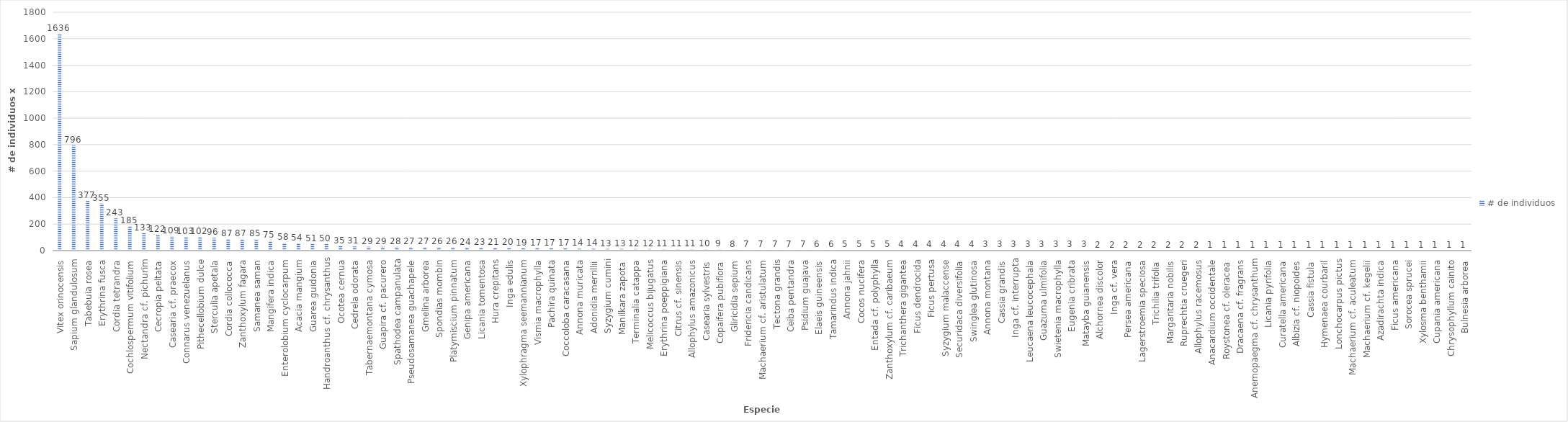
| Category | # de individuos |
|---|---|
| Vitex orinocensis | 1636 |
| Sapium glandulosum | 796 |
| Tabebuia rosea | 377 |
| Erythrina fusca | 355 |
| Cordia tetrandra | 243 |
| Cochlospermum vitifolium | 185 |
| Nectandra cf. pichurim | 133 |
| Cecropia peltata | 122 |
| Casearia cf. praecox | 109 |
| Connarus venezuelanus | 103 |
| Pithecellobium dulce | 102 |
| Sterculia apetala | 96 |
| Cordia collococca | 87 |
| Zanthoxylum fagara | 87 |
| Samanea saman | 85 |
| Mangifera indica | 75 |
| Enterolobium cyclocarpum | 58 |
| Acacia mangium | 54 |
| Guarea guidonia | 51 |
| Handroanthus cf. chrysanthus | 50 |
| Ocotea cernua | 35 |
| Cedrela odorata | 31 |
| Tabernaemontana cymosa | 29 |
| Guapira cf. pacurero | 29 |
| Spathodea campanulata | 28 |
| Pseudosamanea guachapele | 27 |
| Gmelina arborea | 27 |
| Spondias mombin | 26 |
| Platymiscium pinnatum | 26 |
| Genipa americana | 24 |
| Licania tomentosa | 23 |
| Hura crepitans | 21 |
| Inga edulis | 20 |
| Xylophragma seemannianum | 19 |
| Vismia macrophylla | 17 |
| Pachira quinata | 17 |
| Coccoloba caracasana | 17 |
| Annona muricata | 14 |
| Adonidia merrillii | 14 |
| Syzygium cumini | 13 |
| Manilkara zapota | 13 |
| Terminalia catappa | 12 |
| Melicoccus bijugatus | 12 |
| Erythrina poeppigiana | 11 |
| Citrus cf. sinensis | 11 |
| Allophylus amazonicus | 11 |
| Casearia sylvestris | 10 |
| Copaifera pubiflora | 9 |
| Gliricidia sepium | 8 |
| Fridericia candicans | 7 |
| Machaerium cf. aristulatum | 7 |
| Tectona grandis | 7 |
| Ceiba pentandra | 7 |
| Psidium guajava | 7 |
| Elaeis guineensis | 6 |
| Tamarindus indica | 6 |
| Annona jahnii | 5 |
| Cocos nucifera | 5 |
| Entada cf. polyphylla | 5 |
| Zanthoxylum cf. caribaeum | 5 |
| Trichanthera gigantea | 4 |
| Ficus dendrocida | 4 |
| Ficus pertusa | 4 |
| Syzygium malaccense | 4 |
| Securidaca diversifolia | 4 |
| Swinglea glutinosa | 4 |
| Annona montana | 3 |
| Cassia grandis | 3 |
| Inga cf. interrupta | 3 |
| Leucaena leucocephala | 3 |
| Guazuma ulmifolia | 3 |
| Swietenia macrophylla | 3 |
| Eugenia cribrata | 3 |
| Matayba guianensis | 3 |
| Alchornea discolor | 2 |
| Inga cf. vera | 2 |
| Persea americana | 2 |
| Lagerstroemia speciosa | 2 |
| Trichilia trifolia | 2 |
| Margaritaria nobilis | 2 |
| Ruprechtia cruegeri | 2 |
| Allophylus racemosus | 2 |
| Anacardium occidentale | 1 |
| Roystonea cf. oleracea | 1 |
| Dracaena cf. fragrans | 1 |
| Anemopaegma cf. chrysanthum | 1 |
| Licania pyrifolia | 1 |
| Curatella americana | 1 |
| Albizia cf. niopoides | 1 |
| Cassia fistula | 1 |
| Hymenaea courbaril | 1 |
| Lonchocarpus pictus | 1 |
| Machaerium cf. aculeatum | 1 |
| Machaerium cf. kegelii | 1 |
| Azadirachta indica | 1 |
| Ficus americana | 1 |
| Sorocea sprucei | 1 |
| Xylosma benthamii | 1 |
| Cupania americana | 1 |
| Chrysophyllum cainito | 1 |
| Bulnesia arborea | 1 |